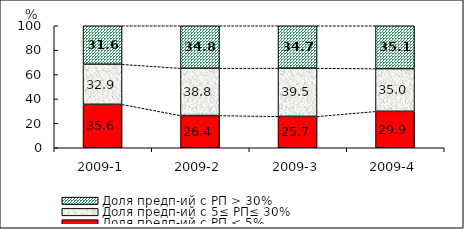
| Category | Доля предп-ий с РП < 5% | Доля предп-ий с 5≤ РП≤ 30% | Доля предп-ий с РП > 30% |
|---|---|---|---|
| 2009-1 | 35.582 | 32.862 | 31.556 |
| 2009-2 | 26.434 | 38.769 | 34.797 |
| 2009-3 | 25.743 | 39.532 | 34.725 |
| 2009-4 | 29.854 | 35.017 | 35.129 |